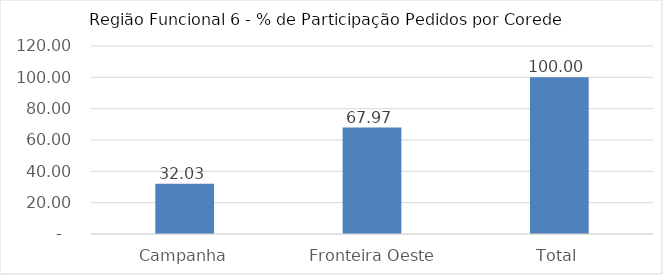
| Category | Series 0 |
|---|---|
| Campanha | 32.031 |
|  Fronteira Oeste | 67.969 |
| Total | 100 |